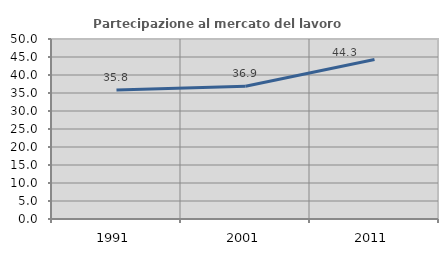
| Category | Partecipazione al mercato del lavoro  femminile |
|---|---|
| 1991.0 | 35.827 |
| 2001.0 | 36.878 |
| 2011.0 | 44.319 |